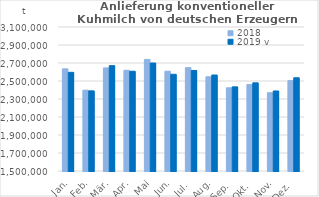
| Category | 2018 | 2019 v |
|---|---|---|
| Jan. | 2635042.782 | 2596344.611 |
| Feb. | 2397796.649 | 2390158.984 |
| Mär. | 2645142.871 | 2670479.86 |
| Apr. | 2618882.994 | 2608232.274 |
| Mai | 2739891.619 | 2699867.183 |
| Jun. | 2608957.964 | 2574550.421 |
| Jul. | 2648563.822 | 2616926.372 |
| Aug. | 2546749.907 | 2566440.526 |
| Sep. | 2424569.386 | 2434965.137 |
| Okt. | 2460015.466 | 2479427.246 |
| Nov. | 2369477.673 | 2389071.582 |
| Dez. | 2504043.412 | 2535881.864 |